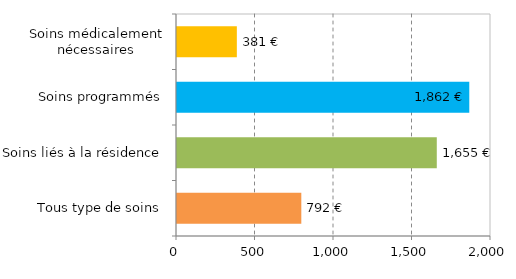
| Category | Series 0 |
|---|---|
| Tous type de soins | 791.814 |
| Soins liés à la résidence | 1654.698 |
| Soins programmés | 1861.663 |
| Soins médicalement nécessaires | 381.18 |